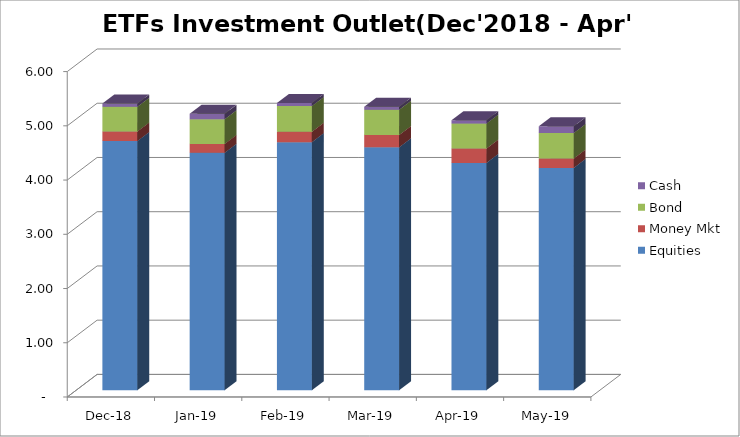
| Category | Equities | Money Mkt | Bond | Cash |
|---|---|---|---|---|
| 2018-12-01 | 4593226725.97 | 177224498.42 | 455822889.82 | 58868504.36 |
| 2019-01-01 | 4377264283.99 | 163856975.18 | 454756838.17 | 99509145.72 |
| 2019-02-01 | 4574101498.89 | 190249365.75 | 475081203.96 | 56714065.08 |
| 2019-03-01 | 4479173842.33 | 225580048.82 | 467336909.16 | 53276506 |
| 2019-04-01 | 4191729465.72 | 263468874.03 | 460460354.97 | 63029070.21 |
| 2019-05-01 | 4099532871.38 | 172710343.84 | 468805980.48 | 125439511.89 |